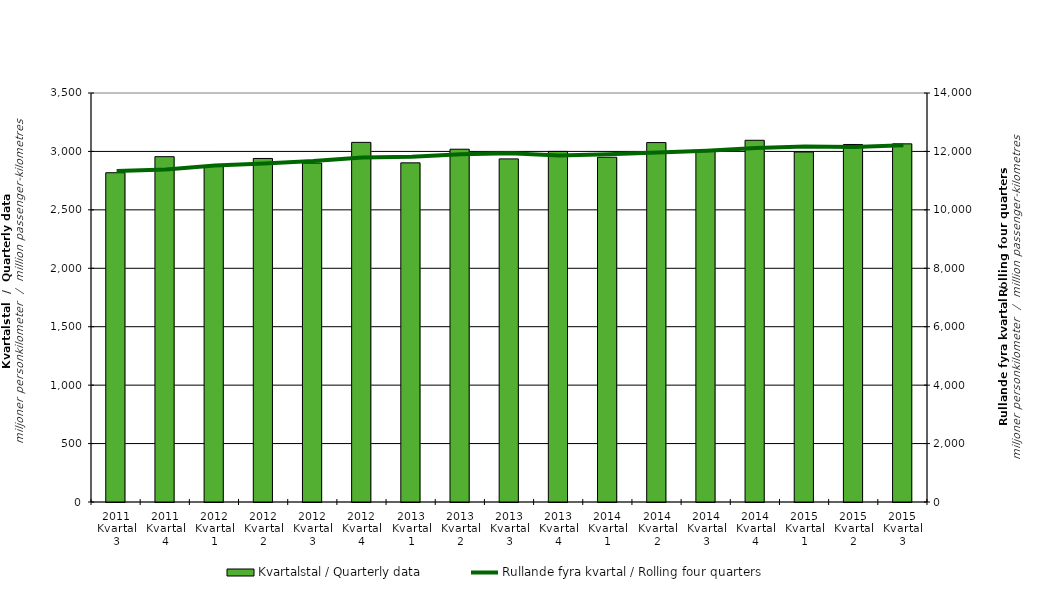
| Category | Kvartalstal / Quarterly data |
|---|---|
| 2011 Kvartal 3 | 2817.734 |
| 2011 Kvartal 4 | 2955.113 |
| 2012 Kvartal 1 | 2874.33 |
| 2012 Kvartal 2 | 2939.777 |
| 2012 Kvartal 3 | 2900.638 |
| 2012 Kvartal 4 | 3077.393 |
| 2013 Kvartal 1 | 2902.284 |
| 2013 Kvartal 2 | 3018.972 |
| 2013 Kvartal 3 | 2936.214 |
| 2013 Kvartal 4 | 3000.041 |
| 2014 Kvartal 1 | 2950.13 |
| 2014 Kvartal 2 | 3075.752 |
| 2014 Kvartal 3 | 2999.774 |
| 2014 Kvartal 4 | 3095.522 |
| 2015 Kvartal 1 | 2995.11 |
| 2015 Kvartal 2 | 3059.487 |
| 2015 Kvartal 3 | 3065.015 |